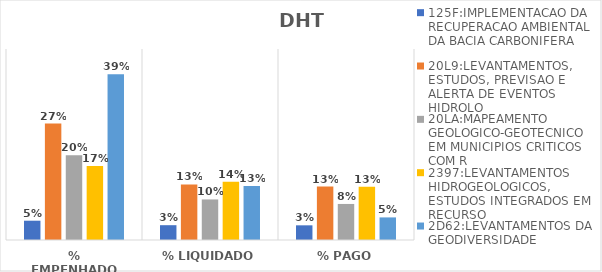
| Category | 125F:IMPLEMENTACAO DA RECUPERACAO AMBIENTAL DA BACIA CARBONIFERA | 20L9:LEVANTAMENTOS, ESTUDOS, PREVISAO E ALERTA DE EVENTOS HIDROLO | 20LA:MAPEAMENTO GEOLOGICO-GEOTECNICO EM MUNICIPIOS CRITICOS COM R | 2397:LEVANTAMENTOS HIDROGEOLOGICOS, ESTUDOS INTEGRADOS EM RECURSO | 2D62:LEVANTAMENTOS DA GEODIVERSIDADE |
|---|---|---|---|---|---|
| % EMPENHADO | 0.045 | 0.274 | 0.199 | 0.175 | 0.39 |
| % LIQUIDADO | 0.035 | 0.131 | 0.096 | 0.137 | 0.127 |
| % PAGO | 0.035 | 0.126 | 0.085 | 0.125 | 0.053 |